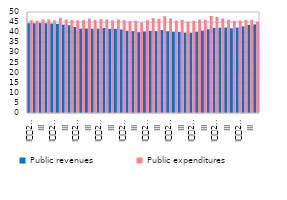
| Category | Public revenues | Public expenditures |
|---|---|---|
| I
2007 | 44.481 | 45.953 |
| II | 44.426 | 45.671 |
| III | 44.504 | 46.253 |
| IV | 44.451 | 46.363 |
| I
2008 | 44.303 | 45.85 |
| II | 44.135 | 47.126 |
| III | 43.713 | 46.359 |
| IV | 43.479 | 46.104 |
| I
2009 | 42.571 | 45.92 |
| II | 41.776 | 46.007 |
| III | 41.808 | 46.728 |
| IV | 41.693 | 46.107 |
| I
2010 | 41.79 | 46.588 |
| II | 42.095 | 46.378 |
| III | 41.666 | 45.944 |
| IV | 41.681 | 46.278 |
| I
2011 | 41.358 | 45.953 |
| II | 40.729 | 45.488 |
| III | 40.531 | 45.656 |
| IV | 39.989 | 44.786 |
| I
2012 | 40.356 | 45.961 |
| II | 40.675 | 46.963 |
| III | 40.555 | 46.648 |
| IV | 41.072 | 47.913 |
| I
2013 | 40.48 | 46.837 |
| II | 40.221 | 45.77 |
| III | 40.088 | 46.18 |
| IV | 39.677 | 45.149 |
| I
2014 | 39.651 | 45.658 |
| II | 40.235 | 46.248 |
| III | 40.8 | 46.14 |
| IV | 41.468 | 48.072 |
| I
2015 | 42.132 | 47.529 |
| II | 42.226 | 46.786 |
| III | 42.281 | 46.181 |
| IV | 41.915 | 45.604 |
| I
2016 | 42.291 | 45.813 |
| II | 42.906 | 46.112 |
| III | 43.597 | 46.063 |
| IV | 43.871 | 45.156 |